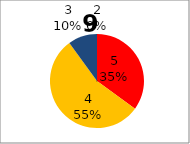
| Category | Series 0 |
|---|---|
| 5.0 | 7 |
| 4.0 | 11 |
| 3.0 | 2 |
| 2.0 | 0 |